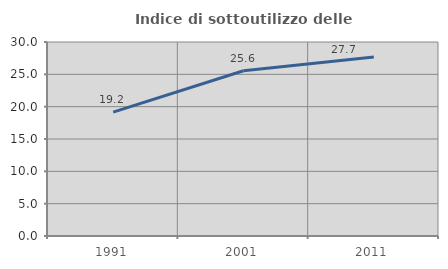
| Category | Indice di sottoutilizzo delle abitazioni  |
|---|---|
| 1991.0 | 19.157 |
| 2001.0 | 25.558 |
| 2011.0 | 27.69 |